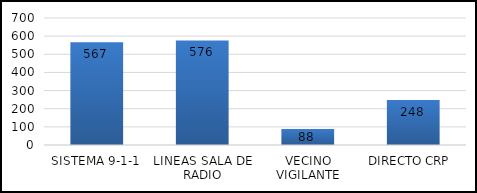
| Category | TOTAL |
|---|---|
| SISTEMA 9-1-1 | 567 |
| LINEAS SALA DE RADIO | 576 |
| VECINO VIGILANTE | 88 |
| DIRECTO CRP  | 248 |